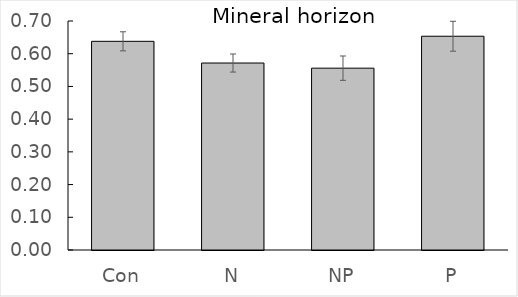
| Category | Series 0 |
|---|---|
| Con | 0.638 |
| N | 0.572 |
| NP | 0.556 |
| P | 0.653 |